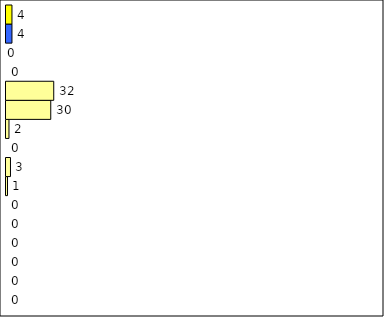
| Category | -2 | -1 | 0 | 1 | 2 | 3 | 4 | 5 | 6 | 7 | 8 | 9 | 10 | 11 | 12 | Perfect Round |
|---|---|---|---|---|---|---|---|---|---|---|---|---|---|---|---|---|
| 0 | 0 | 0 | 0 | 0 | 0 | 0 | 1 | 3 | 0 | 2 | 30 | 32 | 0 | 0 | 4 | 4 |